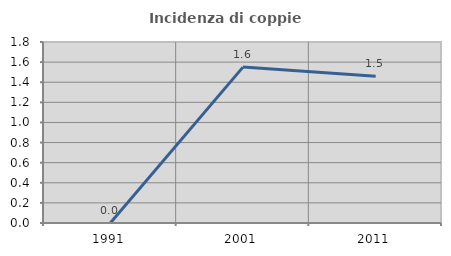
| Category | Incidenza di coppie miste |
|---|---|
| 1991.0 | 0 |
| 2001.0 | 1.55 |
| 2011.0 | 1.46 |